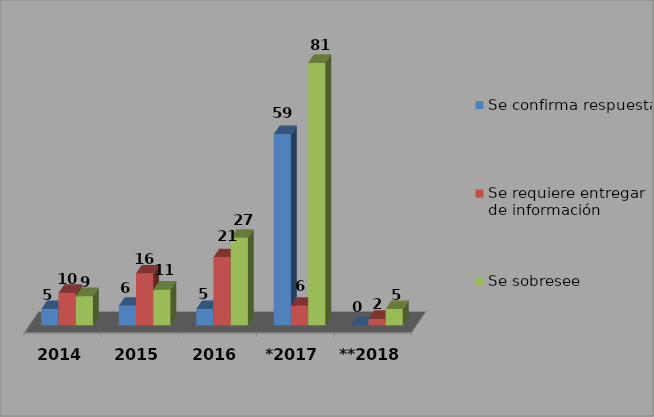
| Category | Se confirma respuesta | Se requiere entregar de información  | Se sobresee  |
|---|---|---|---|
| 2014 | 5 | 10 | 9 |
| 2015 | 6 | 16 | 11 |
| 2016 | 5 | 21 | 27 |
| *2017 | 59 | 6 | 81 |
| **2018 | 0 | 2 | 5 |